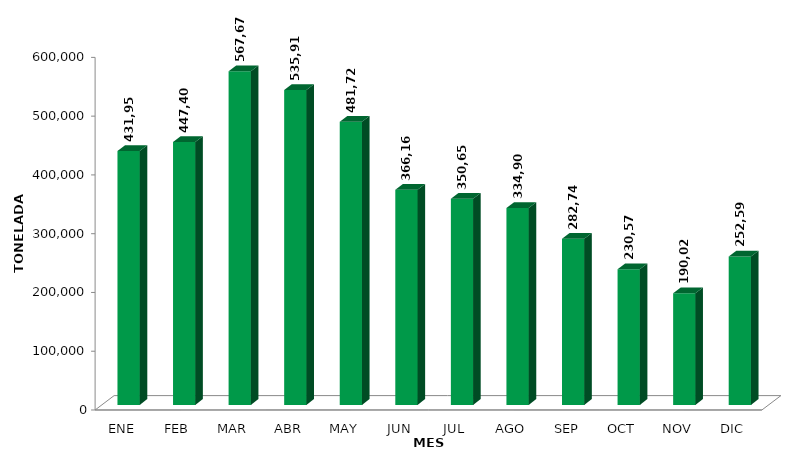
| Category | Series 0 |
|---|---|
| ENE | 431958.09 |
| FEB | 447405.876 |
| MAR | 567669.555 |
| ABR | 535909.723 |
| MAY | 481726.396 |
| JUN | 366160.833 |
| JUL | 350650.791 |
| AGO | 334900.776 |
| SEP | 282747.267 |
| OCT | 230576.313 |
| NOV | 190021.836 |
| DIC | 252590.209 |